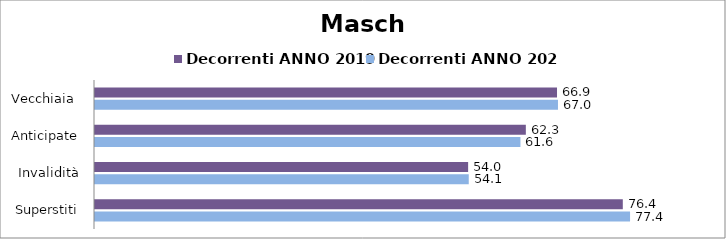
| Category | Decorrenti ANNO 2019 | Decorrenti ANNO 2020 |
|---|---|---|
| Vecchiaia  | 66.85 | 66.99 |
| Anticipate | 62.34 | 61.56 |
| Invalidità | 53.99 | 54.08 |
| Superstiti | 76.37 | 77.42 |